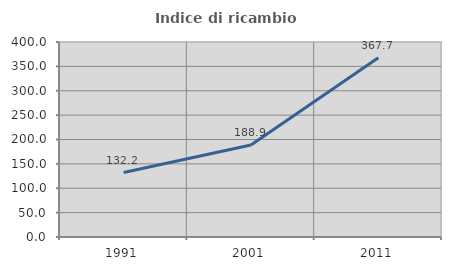
| Category | Indice di ricambio occupazionale  |
|---|---|
| 1991.0 | 132.231 |
| 2001.0 | 188.889 |
| 2011.0 | 367.692 |